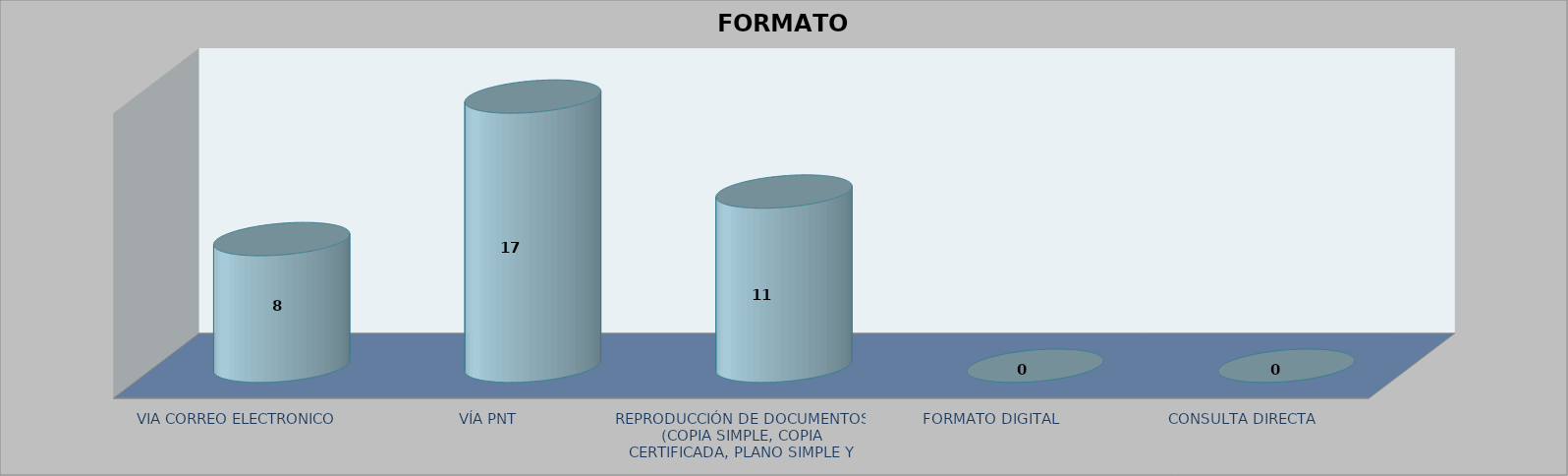
| Category |        FORMATO SOLICITADO | Series 1 | Series 2 |
|---|---|---|---|
| VIA CORREO ELECTRONICO |  |  | 8 |
| VÍA PNT |  |  | 17 |
| REPRODUCCIÓN DE DOCUMENTOS (COPIA SIMPLE, COPIA CERTIFICADA, PLANO SIMPLE Y PLANO CERTIFICADO) |  |  | 11 |
| FORMATO DIGITAL |  |  | 0 |
| CONSULTA DIRECTA |  |  | 0 |